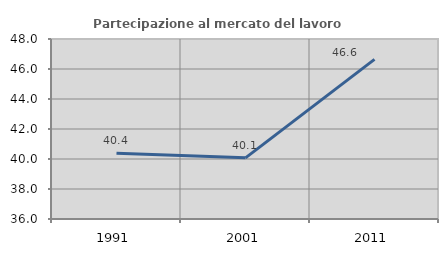
| Category | Partecipazione al mercato del lavoro  femminile |
|---|---|
| 1991.0 | 40.388 |
| 2001.0 | 40.077 |
| 2011.0 | 46.643 |